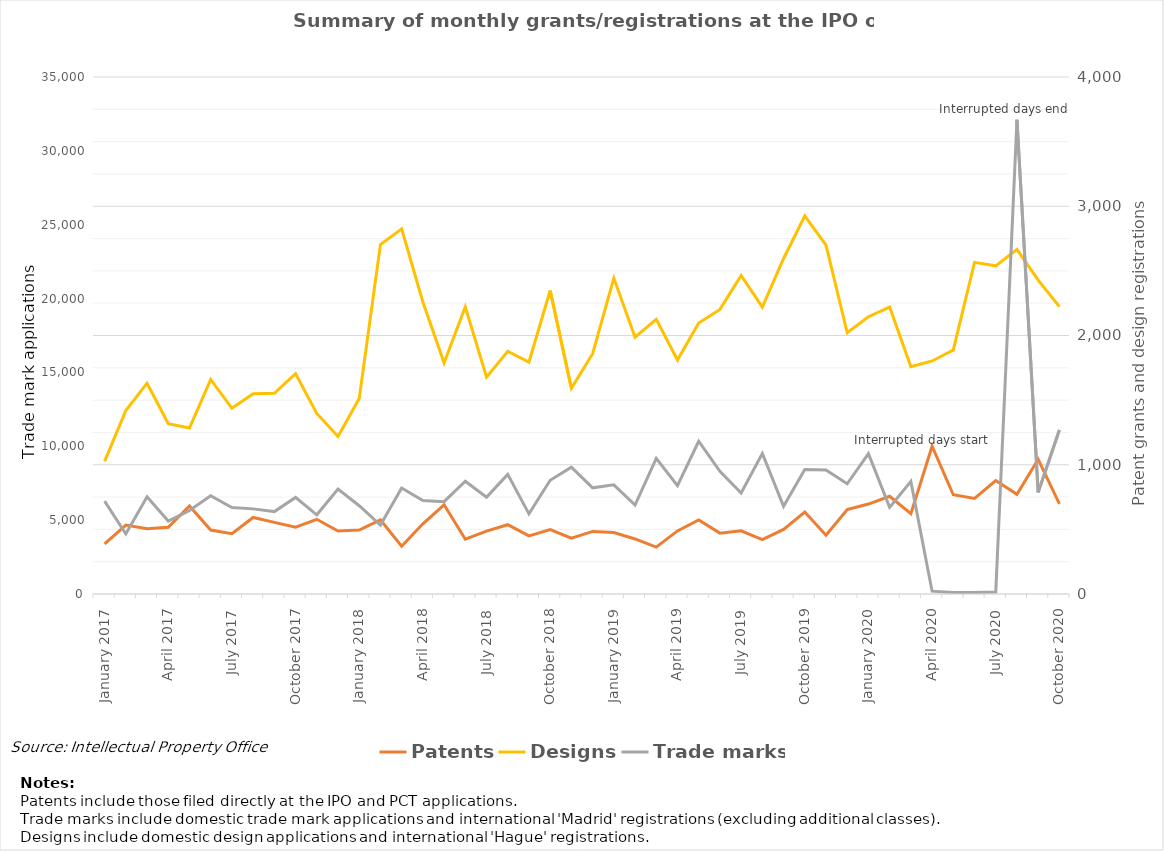
| Category | Patents | Designs |
|---|---|---|
| January 2017 | 387 | 1026 |
| February 2017 | 533 | 1420 |
| March 2017 | 505 | 1631 |
| April 2017 | 516 | 1318 |
| May 2017 | 681 | 1284 |
| June 2017 | 495 | 1660 |
| July 2017 | 466 | 1437 |
| August 2017 | 592 | 1550 |
| September 2017 | 554 | 1553 |
| October 2017 | 517 | 1705 |
| November 2017 | 578 | 1397 |
| December 2017 | 487 | 1218 |
| January 2018 | 495 | 1512 |
| February 2018 | 574 | 2704 |
| March 2018 | 370 | 2825 |
| April 2018 | 543 | 2259 |
| May 2018 | 690 | 1789 |
| June 2018 | 424 | 2222 |
| July 2018 | 486 | 1678 |
| August 2018 | 536 | 1878 |
| September 2018 | 450 | 1795 |
| October 2018 | 498 | 2348 |
| November 2018 | 432 | 1592 |
| December 2018 | 484 | 1859 |
| January 2019 | 475 | 2444 |
| February 2019 | 426 | 1987 |
| March 2019 | 363 | 2125 |
| April 2019 | 488 | 1810 |
| May 2019 | 573 | 2096 |
| June 2019 | 471 | 2202 |
| July 2019 | 489 | 2464 |
| August 2019 | 420 | 2219 |
| September 2019 | 500 | 2596 |
| October 2019 | 634 | 2926 |
| November 2019 | 455 | 2700 |
| December 2019 | 654 | 2021 |
| January 2020 | 696 | 2145 |
| February 2020 | 756 | 2220 |
| March 2020 | 622 | 1758 |
| April 2020 | 1143 | 1803 |
| May 2020 | 768 | 1888 |
| June 2020 | 740 | 2566 |
| July 2020 | 878 | 2539 |
| August 2020 | 771 | 2666 |
| September 2020 | 1042 | 2428 |
| October 2020 | 697 | 2223 |